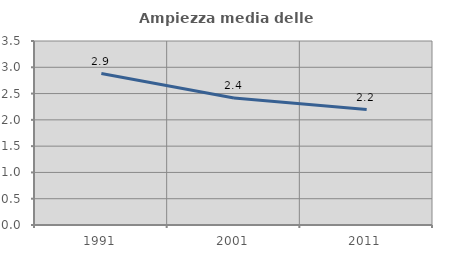
| Category | Ampiezza media delle famiglie |
|---|---|
| 1991.0 | 2.881 |
| 2001.0 | 2.416 |
| 2011.0 | 2.195 |